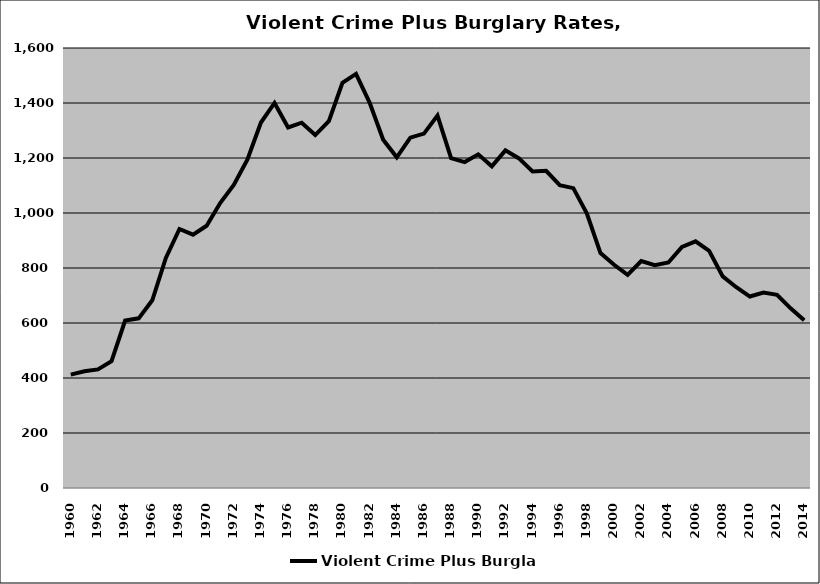
| Category | Violent Crime Plus Burglary |
|---|---|
| 1960.0 | 412.436 |
| 1961.0 | 424.496 |
| 1962.0 | 431.252 |
| 1963.0 | 461.229 |
| 1964.0 | 608.748 |
| 1965.0 | 616.967 |
| 1966.0 | 682.438 |
| 1967.0 | 836.404 |
| 1968.0 | 941.936 |
| 1969.0 | 921.324 |
| 1970.0 | 953.701 |
| 1971.0 | 1036.125 |
| 1972.0 | 1101.694 |
| 1973.0 | 1194.149 |
| 1974.0 | 1329.027 |
| 1975.0 | 1400.076 |
| 1976.0 | 1311.097 |
| 1977.0 | 1328.503 |
| 1978.0 | 1283.383 |
| 1979.0 | 1333.892 |
| 1980.0 | 1473.739 |
| 1981.0 | 1506.039 |
| 1982.0 | 1401.331 |
| 1983.0 | 1266.409 |
| 1984.0 | 1202.403 |
| 1985.0 | 1273.885 |
| 1986.0 | 1288.799 |
| 1987.0 | 1354.263 |
| 1988.0 | 1199.652 |
| 1989.0 | 1185.183 |
| 1990.0 | 1213.298 |
| 1991.0 | 1169.63 |
| 1992.0 | 1227.746 |
| 1993.0 | 1198.428 |
| 1994.0 | 1150.734 |
| 1995.0 | 1153.406 |
| 1996.0 | 1101.267 |
| 1997.0 | 1090.312 |
| 1998.0 | 997.714 |
| 1999.0 | 854.171 |
| 2000.0 | 811.651 |
| 2001.0 | 775.218 |
| 2002.0 | 825.149 |
| 2003.0 | 809.886 |
| 2004.0 | 820.144 |
| 2005.0 | 876.951 |
| 2006.0 | 896.963 |
| 2007.0 | 862.164 |
| 2008.0 | 769.592 |
| 2009.0 | 730.202 |
| 2010.0 | 696.277 |
| 2011.0 | 710.714 |
| 2012.0 | 702.593 |
| 2013.0 | 653.313 |
| 2014.0 | 609.803 |